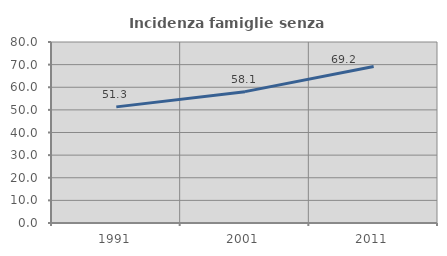
| Category | Incidenza famiglie senza nuclei |
|---|---|
| 1991.0 | 51.326 |
| 2001.0 | 58.062 |
| 2011.0 | 69.206 |